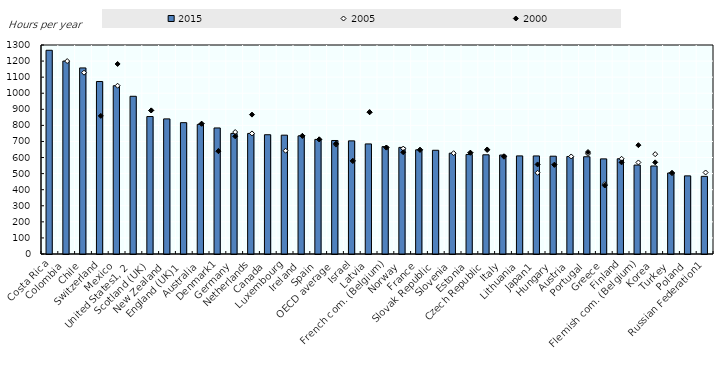
| Category | 2015 |
|---|---|
| Costa Rica | 1267.2 |
| Colombia | 1200 |
| Chile | 1157.36 |
| Switzerland | 1073 |
| Mexico | 1046.667 |
| United States1, 2 | 981 |
| Scotland (UK) | 855 |
| New Zealand | 840.4 |
| England (UK)1 | 817 |
| Australia | 805.98 |
| Denmark1 | 784 |
| Germany | 750.087 |
| Netherlands | 750 |
| Canada | 741.851 |
| Luxembourg | 739.2 |
| Ireland | 734.8 |
| Spain | 712.8 |
| OECD average | 705.999 |
| Israel | 703.676 |
| Latvia | 684.6 |
| French com. (Belgium) | 667.94 |
| Norway | 663.1 |
| France | 648 |
| Slovak Republic | 645.15 |
| Slovenia | 627 |
| Estonia | 619.2 |
| Czech Republic | 617.1 |
| Italy | 615.6 |
| Lithuania | 610.2 |
| Japan1 | 609.911 |
| Hungary | 608.4 |
| Austria | 606.6 |
| Portugal | 605 |
| Greece | 591.68 |
| Finland | 592.2 |
| Flemish com. (Belgium) | 553.125 |
| Korea | 547.54 |
| Turkey | 504 |
| Poland | 486 |
| Russian Federation1 | 483 |